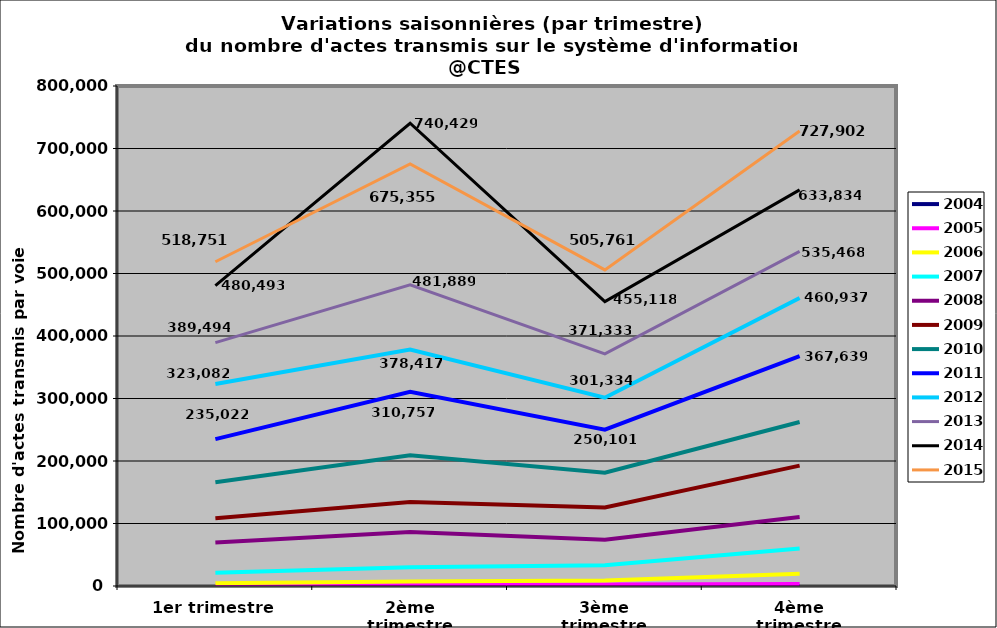
| Category | 2004 | 2005 | 2006 | 2007 | 2008 | 2009 | 2010 | 2011 | 2012 | 2013 | 2014 | 2015 |
|---|---|---|---|---|---|---|---|---|---|---|---|---|
| 1er trimestre | 22 | 324 | 4334 | 21337 | 69629 | 108357 | 166072 | 235022 | 323082 | 389494 | 480493 | 518751 |
| 2ème trimestre | 1 | 1552 | 7105 | 29985 | 86475 | 134526 | 209207 | 310757 | 378417 | 481889 | 740429 | 675355 |
| 3ème trimestre | 0 | 2393 | 8999 | 33033 | 74156 | 125631 | 181314 | 250101 | 301334 | 371333 | 455118 | 505761 |
| 4ème trimestre | 54 | 3391 | 19515 | 59957 | 110286 | 192635 | 262476 | 367639 | 460937 | 535468 | 633834 | 727902 |